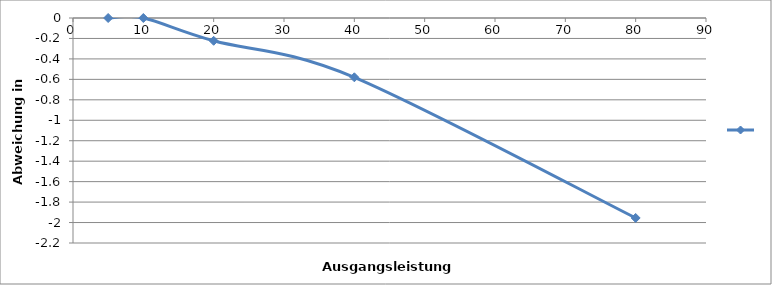
| Category | Series 0 |
|---|---|
| 5.0 | 0 |
| 10.0 | 0 |
| 20.0 | -0.223 |
| 40.0 | -0.58 |
| 80.0 | -1.955 |